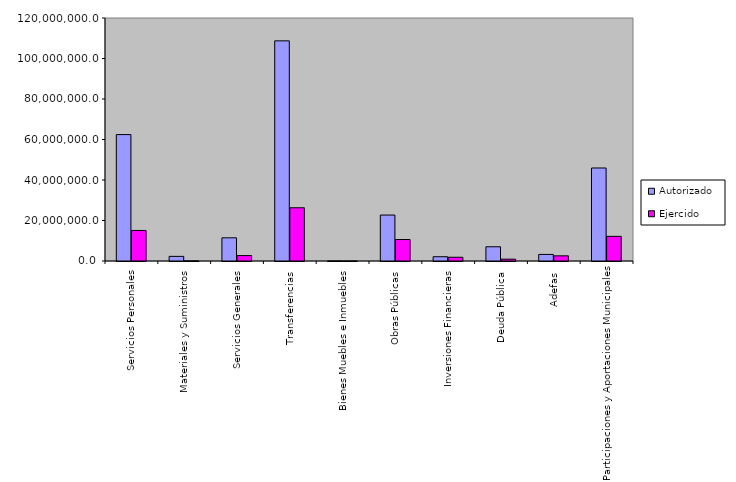
| Category | Autorizado | Ejercido |
|---|---|---|
| 0 | 62425093.1 | 15081605.6 |
| 1 | 2280669.4 | 40999.6 |
| 2 | 11446262.6 | 2675916.8 |
| 3 | 108714268 | 26285749.9 |
| 4 | 27837.8 | 525.8 |
| 5 | 22690976.6 | 10595696.2 |
| 6 | 2112371.6 | 1845328.8 |
| 7 | 7028877.9 | 901892 |
| 8 | 3243691 | 2553096.1 |
| 9 | 45928543.9 | 12164953.6 |